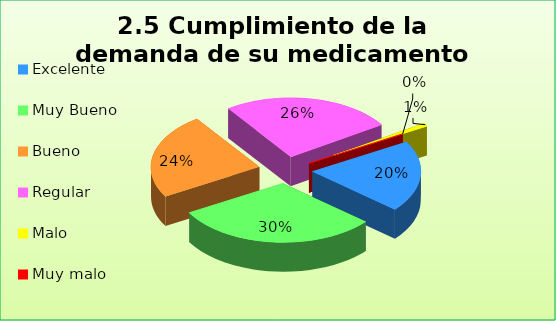
| Category | Series 0 |
|---|---|
| Excelente | 0.195 |
| Muy Bueno | 0.305 |
| Bueno  | 0.236 |
| Regular  | 0.256 |
| Malo  | 0.009 |
| Muy malo  | 0 |